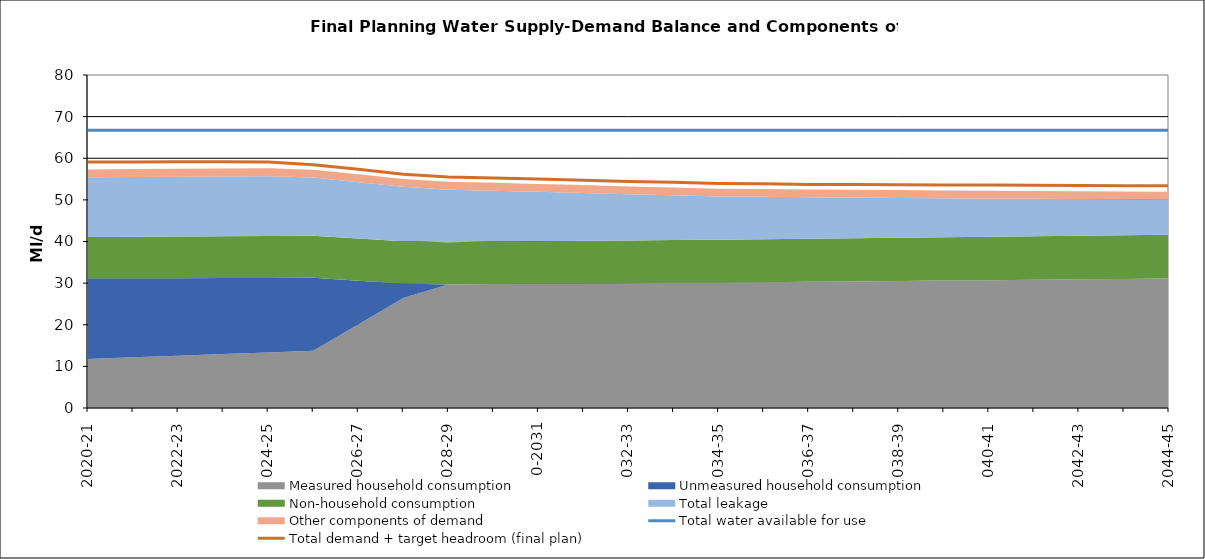
| Category | Total water available for use | Total demand + target headroom (final plan) |
|---|---|---|
| 0 | 66.707 | 59.1 |
| 1 | 66.707 | 59.117 |
| 2 | 66.707 | 59.151 |
| 3 | 66.707 | 59.173 |
| 4 | 66.707 | 59.127 |
| 5 | 66.707 | 58.459 |
| 6 | 66.707 | 57.339 |
| 7 | 66.707 | 56.179 |
| 8 | 66.707 | 55.499 |
| 9 | 66.707 | 55.278 |
| 10 | 66.707 | 55.014 |
| 11 | 66.707 | 54.705 |
| 12 | 66.707 | 54.395 |
| 13 | 66.707 | 54.212 |
| 14 | 66.707 | 53.933 |
| 15 | 66.707 | 53.872 |
| 16 | 66.707 | 53.676 |
| 17 | 66.707 | 53.691 |
| 18 | 66.707 | 53.654 |
| 19 | 66.707 | 53.593 |
| 20 | 66.707 | 53.603 |
| 21 | 66.707 | 53.527 |
| 22 | 66.707 | 53.46 |
| 23 | 66.707 | 53.407 |
| 24 | 66.707 | 53.414 |